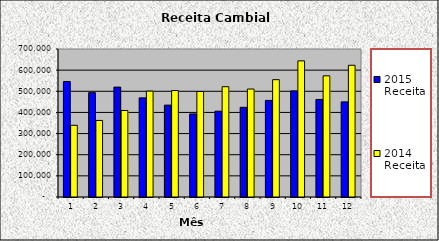
| Category | 2015 Receita | 2014 Receita |
|---|---|---|
| 0 | 546288 | 339097 |
| 1 | 493482 | 362061 |
| 2 | 519708 | 409264 |
| 3 | 468848 | 500838 |
| 4 | 434545 | 503699 |
| 5 | 392821 | 498929 |
| 6 | 405777 | 521650 |
| 7 | 424162 | 510657 |
| 8 | 456927.7 | 554940.717 |
| 9 | 501694 | 643800 |
| 10 | 461321 | 573103 |
| 11 | 449840.8 | 623062 |